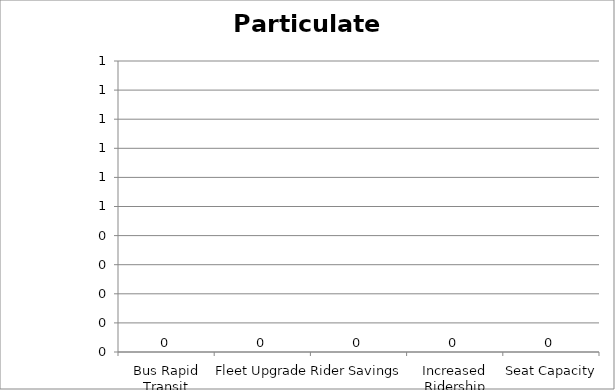
| Category | Particulate Matter |
|---|---|
| Bus Rapid Transit | 0 |
| Fleet Upgrade | 0 |
| Rider Savings | 0 |
| Increased Ridership | 0 |
| Seat Capacity | 0 |